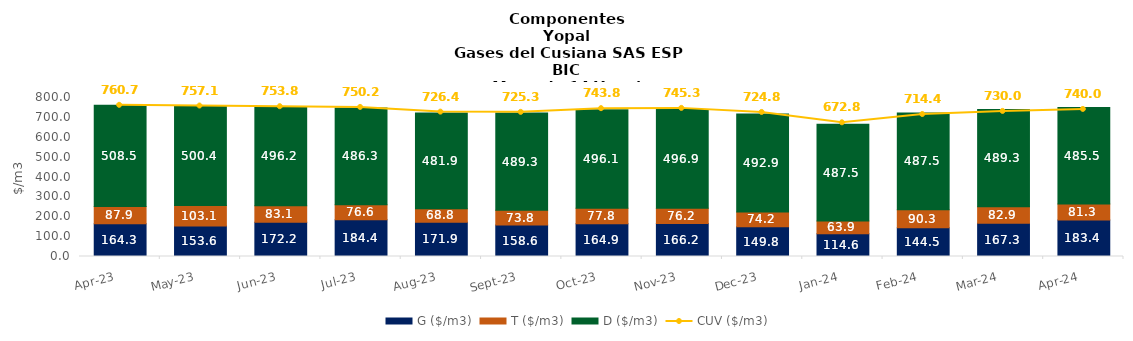
| Category | G ($/m3) | T ($/m3) | D ($/m3) |
|---|---|---|---|
| 2023-04-01 | 164.25 | 87.89 | 508.45 |
| 2023-05-01 | 153.57 | 103.08 | 500.4 |
| 2023-06-01 | 172.16 | 83.07 | 496.23 |
| 2023-07-01 | 184.42 | 76.55 | 486.26 |
| 2023-08-01 | 171.91 | 68.78 | 481.89 |
| 2023-09-01 | 158.55 | 73.83 | 489.25 |
| 2023-10-01 | 164.94 | 77.79 | 496.13 |
| 2023-11-01 | 166.18 | 76.24 | 496.87 |
| 2023-12-01 | 149.82 | 74.15 | 492.91 |
| 2024-01-01 | 114.55 | 63.9 | 487.46 |
| 2024-02-01 | 144.5 | 90.3 | 487.45 |
| 2024-03-01 | 167.32 | 82.93 | 489.29 |
| 2024-04-01 | 183.39 | 81.33 | 485.49 |